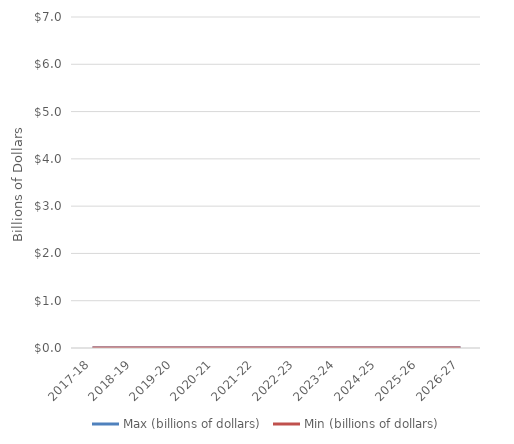
| Category | Max (billions of dollars) | Min (billions of dollars) |
|---|---|---|
| 2017-18 | 0.001 | 0.001 |
| 2018-19 | 0.001 | 0.001 |
| 2019-20 | 0.001 | 0.001 |
| 2020-21 | 0.001 | 0.001 |
| 2021-22 | 0.001 | 0.001 |
| 2022-23 | 0.001 | 0.001 |
| 2023-24 | 0.001 | 0.001 |
| 2024-25 | 0.001 | 0.001 |
| 2025-26 | 0.001 | 0.001 |
| 2026-27 | 0.001 | 0.001 |